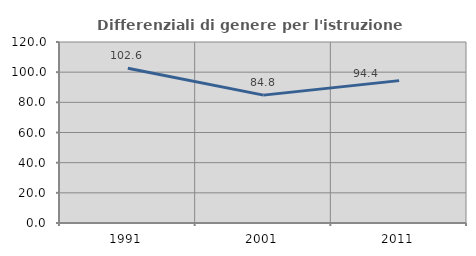
| Category | Differenziali di genere per l'istruzione superiore |
|---|---|
| 1991.0 | 102.553 |
| 2001.0 | 84.774 |
| 2011.0 | 94.388 |